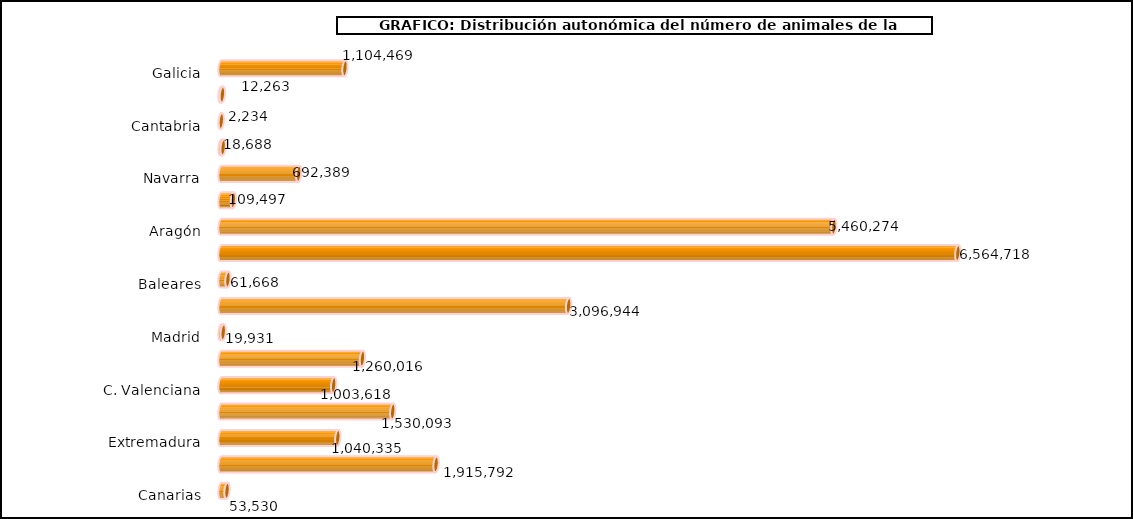
| Category | num. Animales |
|---|---|
|   Galicia | 1104469 |
|   P. de Asturias | 12263 |
|   Cantabria | 2234 |
|   País Vasco | 18688 |
|   Navarra | 692389 |
|   La Rioja | 109497 |
|   Aragón | 5460274 |
|   Cataluña | 6564718 |
|   Baleares | 61668 |
|   Castilla y León | 3096944 |
|   Madrid | 19931 |
|   Castilla – La Mancha | 1260016 |
|   C. Valenciana | 1003618 |
|   R. de Murcia | 1530093 |
|   Extremadura | 1040335 |
|   Andalucía | 1915792 |
|   Canarias | 53530 |